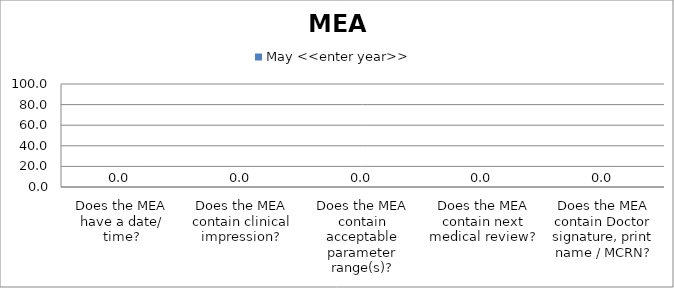
| Category | May <<enter year>> |
|---|---|
| Does the MEA have a date/ time? | 0 |
| Does the MEA contain clinical impression? | 0 |
| Does the MEA contain acceptable parameter range(s)? | 0 |
| Does the MEA contain next medical review? | 0 |
| Does the MEA contain Doctor signature, print name / MCRN? | 0 |